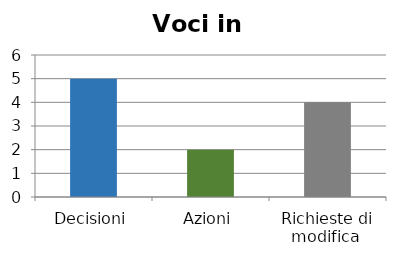
| Category | Series 0 |
|---|---|
| Decisioni | 5 |
| Azioni | 2 |
| Richieste di modifica  | 4 |